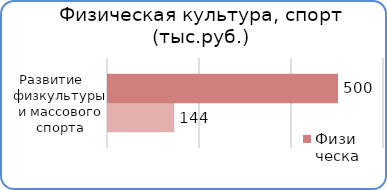
| Category | Факт | План  |
|---|---|---|
| Развитие физической культуры и массового спорта | 144100 | 500000 |